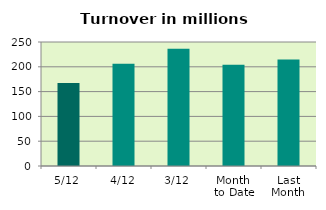
| Category | Series 0 |
|---|---|
| 5/12 | 167.24 |
| 4/12 | 205.997 |
| 3/12 | 236.567 |
| Month 
to Date | 204.339 |
| Last
Month | 214.794 |